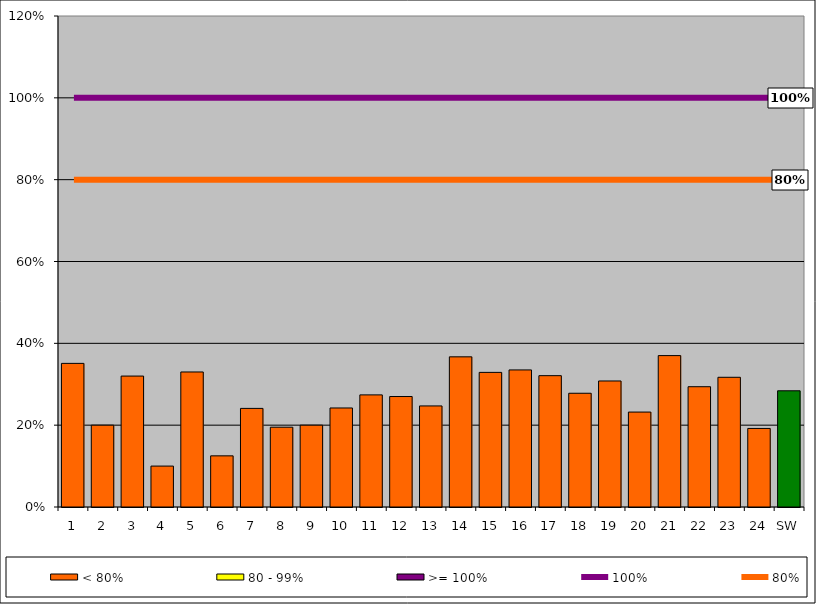
| Category | < 80% | 80 - 99% | >= 100% |
|---|---|---|---|
| 1 | 0.351 | 0 | 0 |
| 2 | 0.2 | 0 | 0 |
| 3 | 0.32 | 0 | 0 |
| 4 | 0.1 | 0 | 0 |
| 5 | 0.33 | 0 | 0 |
| 6 | 0.125 | 0 | 0 |
| 7 | 0.241 | 0 | 0 |
| 8 | 0.195 | 0 | 0 |
| 9 | 0.2 | 0 | 0 |
| 10 | 0.242 | 0 | 0 |
| 11 | 0.274 | 0 | 0 |
| 12 | 0.27 | 0 | 0 |
| 13 | 0.247 | 0 | 0 |
| 14 | 0.367 | 0 | 0 |
| 15 | 0.329 | 0 | 0 |
| 16 | 0.335 | 0 | 0 |
| 17 | 0.321 | 0 | 0 |
| 18 | 0.278 | 0 | 0 |
| 19 | 0.308 | 0 | 0 |
| 20 | 0.232 | 0 | 0 |
| 21 | 0.37 | 0 | 0 |
| 22 | 0.294 | 0 | 0 |
| 23 | 0.317 | 0 | 0 |
| 24 | 0.192 | 0 | 0 |
| SW | 0.284 | 0 | 0 |